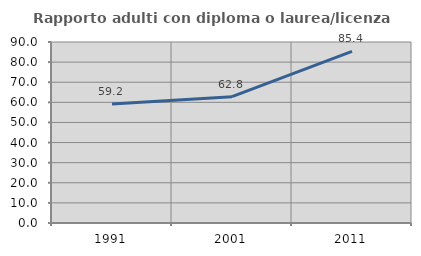
| Category | Rapporto adulti con diploma o laurea/licenza media  |
|---|---|
| 1991.0 | 59.184 |
| 2001.0 | 62.821 |
| 2011.0 | 85.366 |